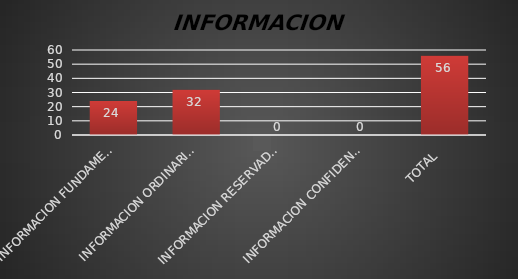
| Category | Series 1 |
|---|---|
| INFORMACION FUNDAMENTAL  | 24 |
| INFORMACION ORDINARIA  | 32 |
| INFORMACION RESERVADA  | 0 |
| INFORMACION CONFIDENCIAL  | 0 |
| TOTAL  | 56 |